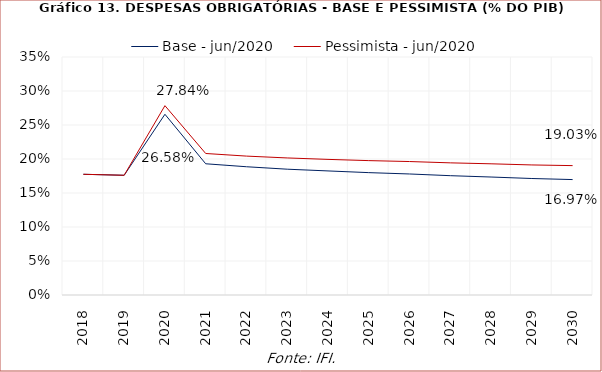
| Category | Base - jun/2020 | Pessimista - jun/2020 |
|---|---|---|
| 2018.0 | 0.178 | 0.178 |
| 2019.0 | 0.176 | 0.176 |
| 2020.0 | 0.266 | 0.278 |
| 2021.0 | 0.193 | 0.208 |
| 2022.0 | 0.189 | 0.204 |
| 2023.0 | 0.185 | 0.202 |
| 2024.0 | 0.182 | 0.199 |
| 2025.0 | 0.18 | 0.198 |
| 2026.0 | 0.178 | 0.196 |
| 2027.0 | 0.175 | 0.194 |
| 2028.0 | 0.173 | 0.193 |
| 2029.0 | 0.171 | 0.191 |
| 2030.0 | 0.17 | 0.19 |